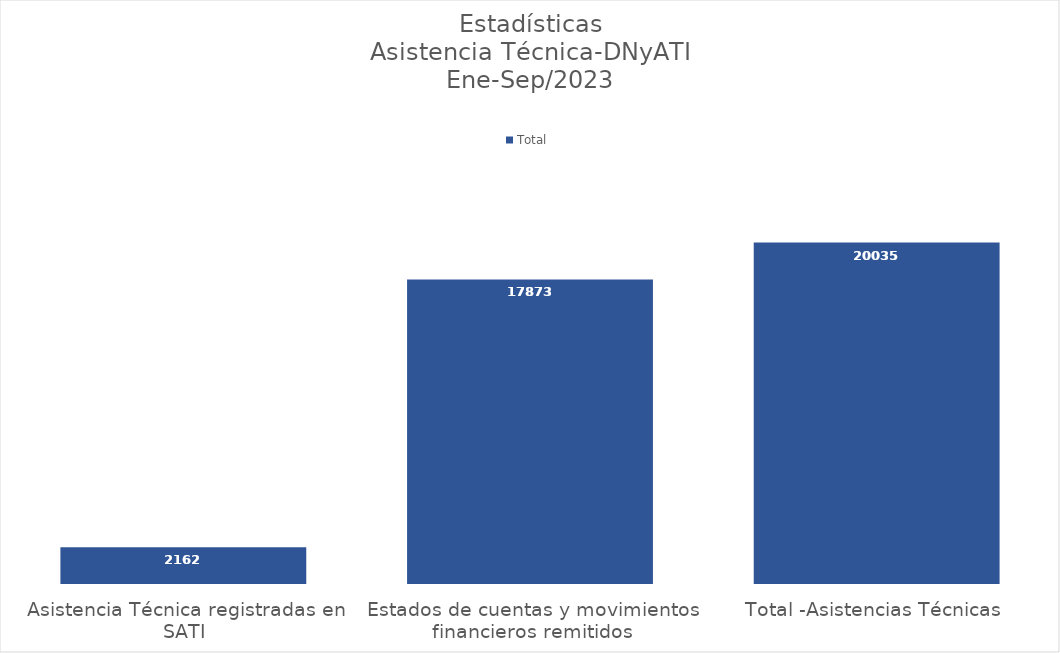
| Category | Total |
|---|---|
| Asistencia Técnica registradas en SATI | 2162 |
| Estados de cuentas y movimientos financieros remitidos | 17873 |
| Total -Asistencias Técnicas  | 20035 |